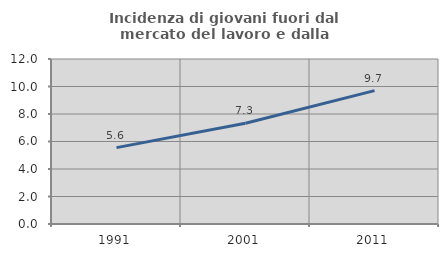
| Category | Incidenza di giovani fuori dal mercato del lavoro e dalla formazione  |
|---|---|
| 1991.0 | 5.556 |
| 2001.0 | 7.33 |
| 2011.0 | 9.701 |